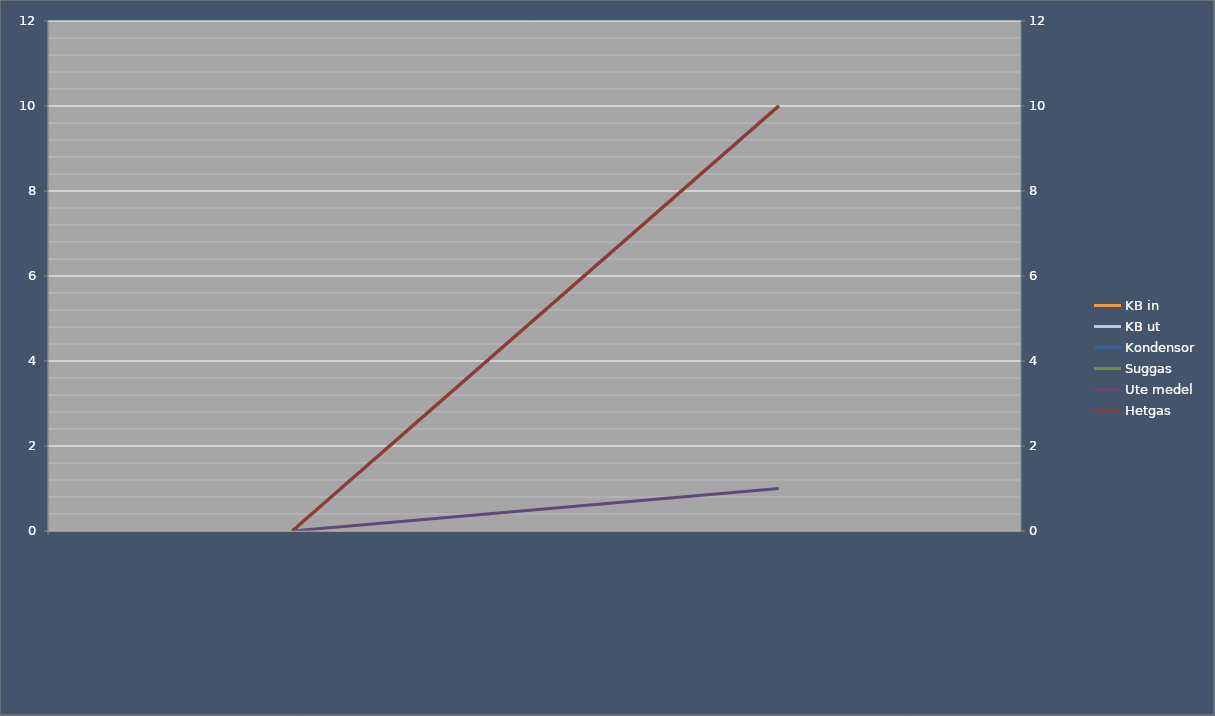
| Category | KB in | KB ut | Kondensor | Suggas | Ute medel |
|---|---|---|---|---|---|
|  | 0 | 0 | 0 | 0 | 0 |
|  | 10 | 10 | 10 | 10 | 1 |